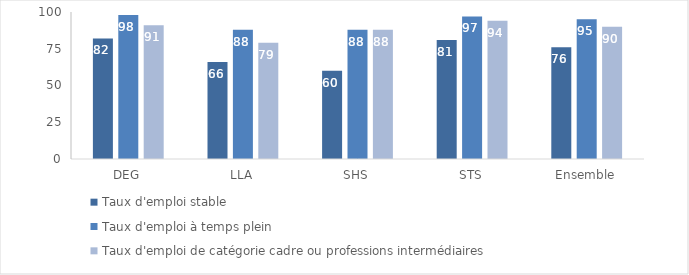
| Category | Taux d'emploi stable | Taux d'emploi à temps plein | Taux d'emploi de catégorie cadre ou professions intermédiaires |
|---|---|---|---|
| DEG | 82 | 98 | 91 |
| LLA | 66 | 88 | 79 |
| SHS | 60 | 88 | 88 |
| STS | 81 | 97 | 94 |
| Ensemble | 76 | 95 | 90 |